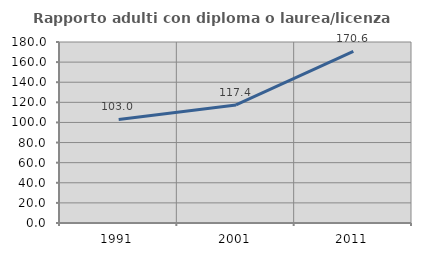
| Category | Rapporto adulti con diploma o laurea/licenza media  |
|---|---|
| 1991.0 | 103.008 |
| 2001.0 | 117.391 |
| 2011.0 | 170.647 |